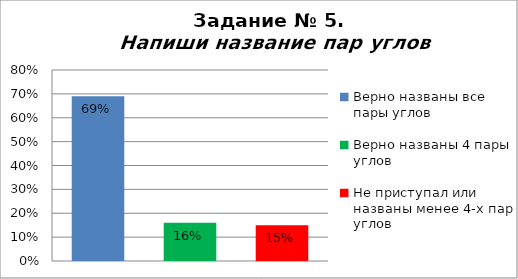
| Category | Напиши название пар углов |
|---|---|
| Верно названы все пары углов | 0.69 |
| Верно названы 4 пары углов | 0.16 |
| Не приступал или названы менее 4-х пар углов | 0.15 |